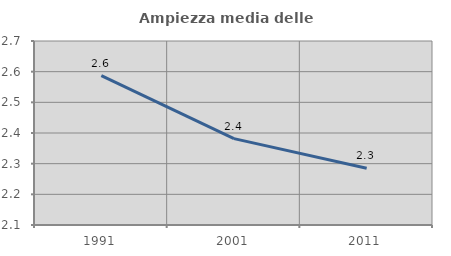
| Category | Ampiezza media delle famiglie |
|---|---|
| 1991.0 | 2.587 |
| 2001.0 | 2.382 |
| 2011.0 | 2.285 |